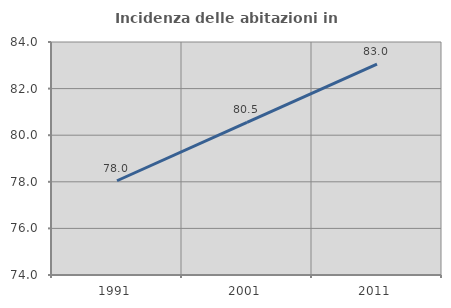
| Category | Incidenza delle abitazioni in proprietà  |
|---|---|
| 1991.0 | 78.045 |
| 2001.0 | 80.545 |
| 2011.0 | 83.045 |